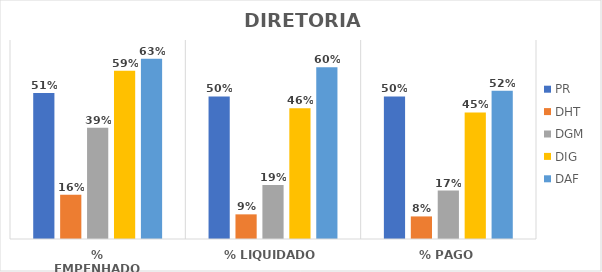
| Category | PR | DHT | DGM | DIG | DAF |
|---|---|---|---|---|---|
| % EMPENHADO | 0.513 | 0.155 | 0.391 | 0.591 | 0.634 |
| % LIQUIDADO | 0.501 | 0.087 | 0.19 | 0.46 | 0.604 |
| % PAGO | 0.501 | 0.079 | 0.17 | 0.445 | 0.522 |